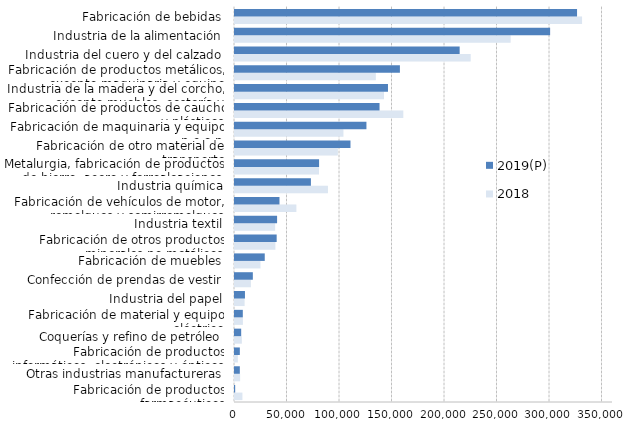
| Category | 2018 | 2019(P) |
|---|---|---|
| Fabricación de productos farmacéuticos | 7042.321 | 175.743 |
| Otras industrias manufactureras | 4888.11 | 4601.5 |
| Fabricación de productos informáticos, electrónicos y ópticos | 2705.444 | 4602.553 |
| Coquerías y refino de petróleo | 6523.902 | 5890.655 |
| Fabricación de material y equipo eléctrico | 7535.062 | 7439.16 |
| Industria del papel | 9131.73 | 9483.599 |
| Confección de prendas de vestir | 15133.135 | 16987.359 |
| Fabricación de muebles | 24280.961 | 28329.71 |
| Fabricación de otros productos minerales no metálicos | 38486.405 | 39688.437 |
| Industria textil | 38215.163 | 40089.13 |
| Fabricación de vehículos de motor, remolques y semirremolques | 58454.263 | 42369.566 |
| Industria química | 88521.608 | 72304.002 |
| Metalurgia, fabricación de productos de hierro, acero y ferroaleaciones | 80007.384 | 80079.187 |
| Fabricación de otro material de transporte | 97970.778 | 109974.322 |
| Fabricación de maquinaria y equipo n.c.o.p. | 103290.256 | 125181.423 |
| Fabricación de productos de caucho y plásticos | 160301.186 | 137655.498 |
| Industria de la madera y del corcho, excepto muebles, cestería y espartería | 141883.112 | 145688.313 |
| Fabricación de productos metálicos, excepto maquinaria y equipo | 134135.984 | 157049.968 |
| Industria del cuero y del calzado | 224470.039 | 213967.78 |
| Industria de la alimentación | 262503.434 | 300123.781 |
| Fabricación de bebidas | 330555.239 | 325765.07 |